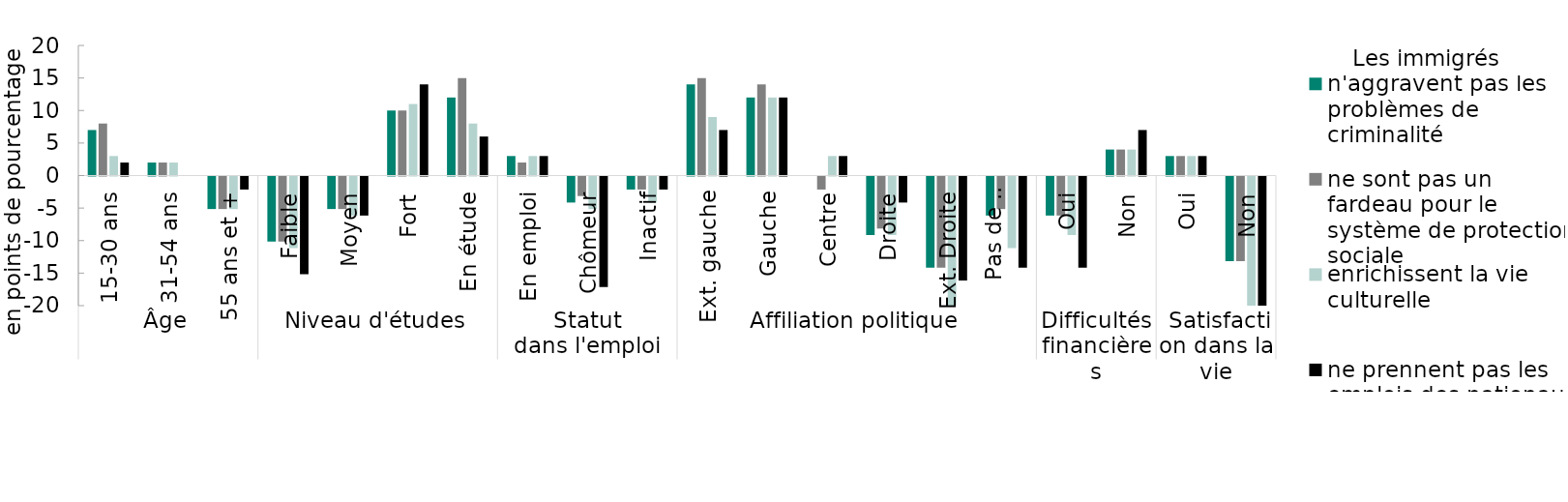
| Category | n'aggravent pas les problèmes de criminalité | ne sont pas un fardeau pour le système de protection sociale | enrichissent la vie culturelle | ne prennent pas les emplois des nationaux |
|---|---|---|---|---|
| 0 | 7 | 8 | 3 | 2 |
| 1 | 2 | 2 | 2 | 0 |
| 2 | -5 | -5 | -5 | -2 |
| 3 | -10 | -10 | -11 | -15 |
| 4 | -5 | -5 | -6 | -6 |
| 5 | 10 | 10 | 11 | 14 |
| 6 | 12 | 15 | 8 | 6 |
| 7 | 3 | 2 | 3 | 3 |
| 8 | -4 | -3 | -5 | -17 |
| 9 | -2 | -2 | -4 | -2 |
| 10 | 14 | 15 | 9 | 7 |
| 11 | 12 | 14 | 12 | 12 |
| 12 | 0 | -2 | 3 | 3 |
| 13 | -9 | -8 | -9 | -4 |
| 14 | -14 | -14 | -23 | -16 |
| 15 | -6 | -5 | -11 | -14 |
| 16 | -6 | -6 | -9 | -14 |
| 17 | 4 | 4 | 4 | 7 |
| 18 | 3 | 3 | 3 | 3 |
| 19 | -13 | -13 | -20 | -20 |